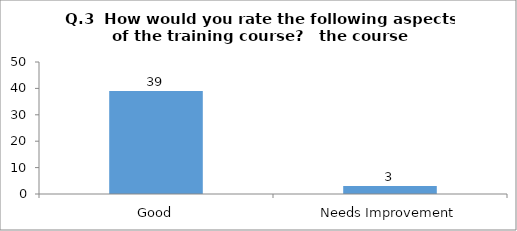
| Category | Q.3  How would you rate the following aspects of the training course?  |
|---|---|
| Good | 39 |
| Needs Improvement | 3 |